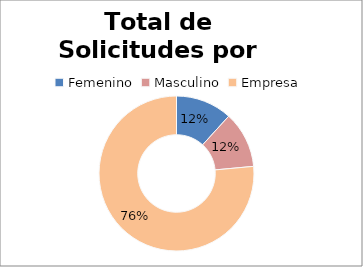
| Category | Series 0 |
|---|---|
| 0 | 2 |
| 1 | 2 |
| 2 | 13 |